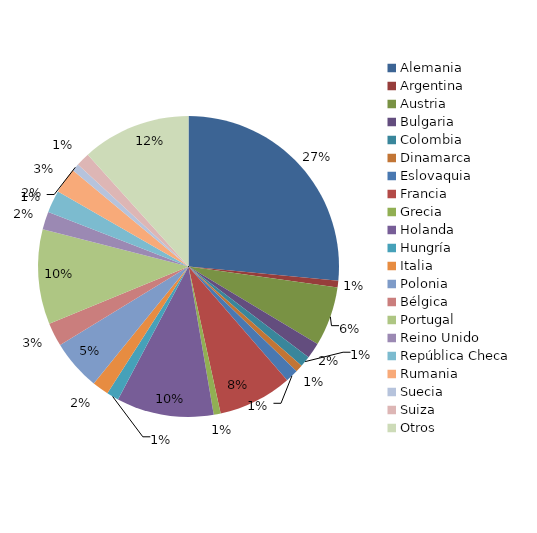
| Category | Comisiones Rogatorias |
|---|---|
| Alemania | 1388 |
| Argentina | 38 |
| Austria | 334 |
| Bulgaria | 89 |
| Colombia | 61 |
| Dinamarca | 41 |
| Eslovaquia | 72 |
| Francia | 416 |
| Grecia | 39 |
| Holanda | 547 |
| Hungría | 68 |
| Italia | 93 |
| Polonia | 284 |
| Bélgica | 133 |
| Portugal | 533 |
| Reino Unido  | 101 |
| República Checa | 125 |
| Rumania | 144 |
| Suecia | 43 |
| Suiza | 77 |
| Otros | 611 |